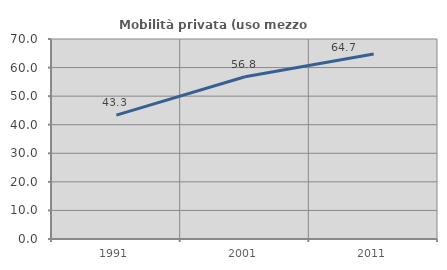
| Category | Mobilità privata (uso mezzo privato) |
|---|---|
| 1991.0 | 43.348 |
| 2001.0 | 56.771 |
| 2011.0 | 64.744 |